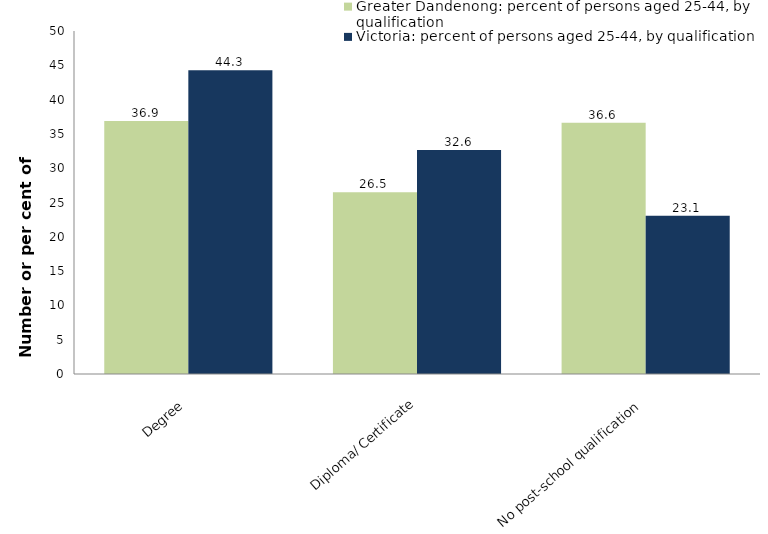
| Category | Greater Dandenong: percent of persons aged 25-44, by qualification | Victoria: percent of persons aged 25-44, by qualification |
|---|---|---|
| Degree | 36.872 | 44.28 |
| Diploma/ Certificate | 26.51 | 32.649 |
| No post-school qualification | 36.618 | 23.071 |